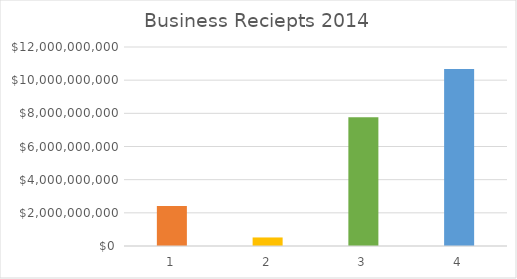
| Category | Series 0 |
|---|---|
| 0 | 2405652249.059 |
| 1 | 514839957.85 |
| 2 | 7759302949.665 |
| 3 | 10679795156.574 |